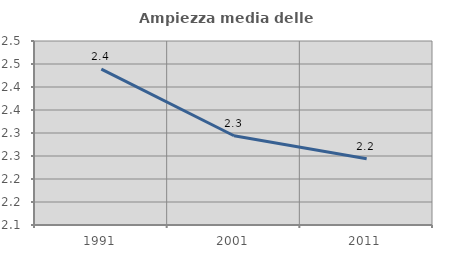
| Category | Ampiezza media delle famiglie |
|---|---|
| 1991.0 | 2.439 |
| 2001.0 | 2.294 |
| 2011.0 | 2.244 |